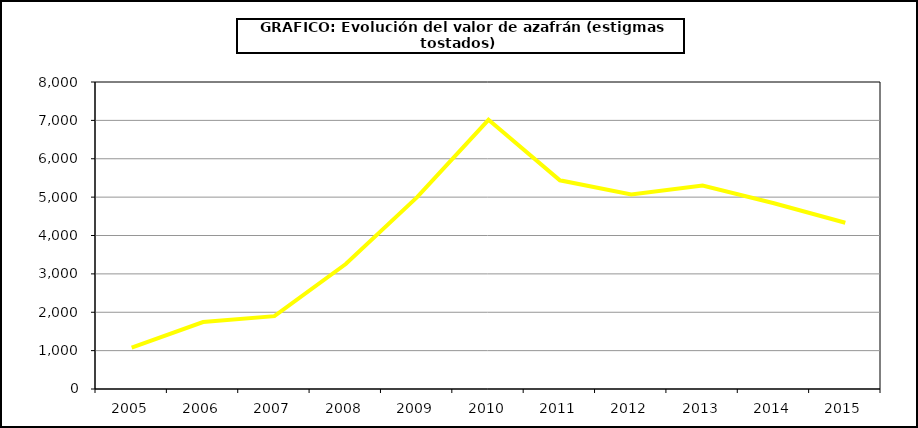
| Category | Valor |
|---|---|
| 2005.0 | 1076.135 |
| 2006.0 | 1745.439 |
| 2007.0 | 1898.858 |
| 2008.0 | 3257.208 |
| 2009.0 | 5000.541 |
| 2010.0 | 7014.469 |
| 2011.0 | 5438.177 |
| 2012.0 | 5071.99 |
| 2013.0 | 5302.253 |
| 2014.0 | 4841.325 |
| 2015.0 | 4331 |